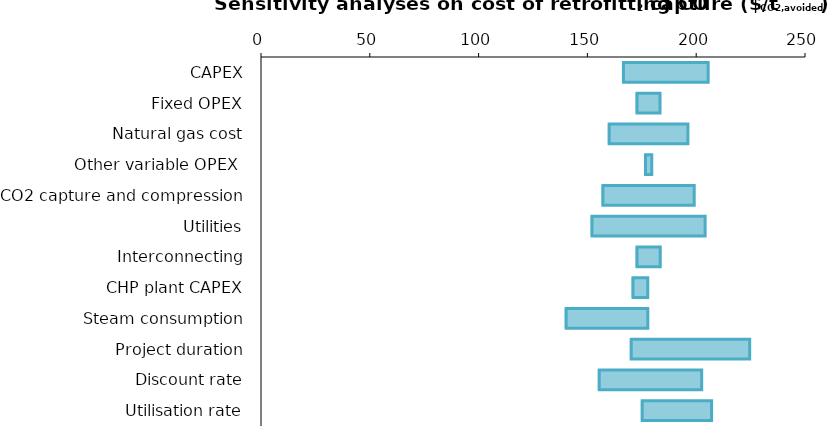
| Category | Minimum value | Increase of the parameter |
|---|---|---|
| CAPEX | 165.879 | 39.615 |
| Fixed OPEX | 172.118 | 11.292 |
| Natural gas cost | 159.331 | 36.864 |
| Other variable OPEX  | 175.99 | 3.546 |
| CO2 capture and compression | 156.443 | 42.641 |
| Utilities | 151.43 | 52.666 |
| Interconnecting | 172.088 | 11.351 |
| CHP plant CAPEX | 170.277 | 7.487 |
| Steam consumption | 139.545 | 38.219 |
| Project duration | 169.459 | 55.118 |
| Discount rate | 154.754 | 47.763 |
| Utilisation rate | 174.507 | 32.56 |